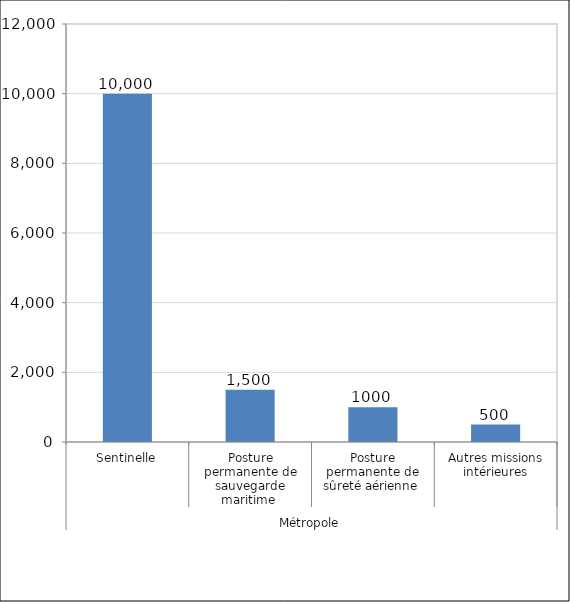
| Category | Effectif  |
|---|---|
| 0 | 10000 |
| 1 | 1500 |
| 2 | 1000 |
| 3 | 500 |